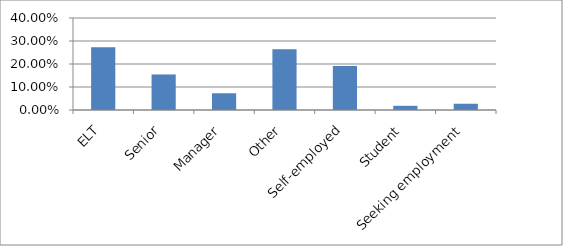
| Category | Series 0 |
|---|---|
| ELT | 0.273 |
| Senior | 0.155 |
| Manager | 0.073 |
| Other | 0.264 |
| Self-employed | 0.191 |
| Student | 0.018 |
| Seeking employment | 0.027 |